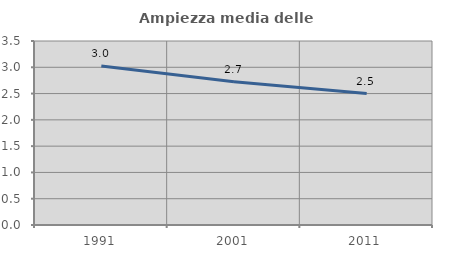
| Category | Ampiezza media delle famiglie |
|---|---|
| 1991.0 | 3.024 |
| 2001.0 | 2.723 |
| 2011.0 | 2.5 |